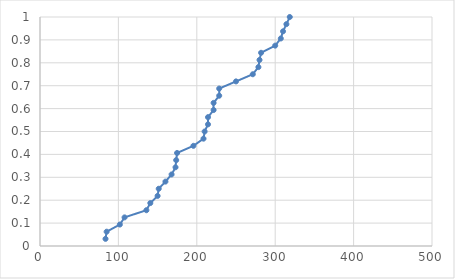
| Category | Series 0 |
|---|---|
| 83.57142857142857 | 0.031 |
| 85.0 | 0.062 |
| 101.85714285714286 | 0.094 |
| 107.85714285714286 | 0.125 |
| 135.71428571428572 | 0.156 |
| 140.71428571428572 | 0.188 |
| 150.0 | 0.219 |
| 151.42857142857142 | 0.25 |
| 160.0 | 0.281 |
| 167.85714285714286 | 0.312 |
| 172.85714285714286 | 0.344 |
| 173.71428571428572 | 0.375 |
| 174.85714285714286 | 0.406 |
| 195.71428571428572 | 0.438 |
| 208.57142857142858 | 0.469 |
| 210.0 | 0.5 |
| 214.28571428571428 | 0.531 |
| 214.28571428571428 | 0.562 |
| 221.42857142857142 | 0.594 |
| 221.42857142857142 | 0.625 |
| 228.57142857142858 | 0.656 |
| 228.57142857142858 | 0.688 |
| 250.0 | 0.719 |
| 271.42857142857144 | 0.75 |
| 278.57142857142856 | 0.781 |
| 280.0 | 0.812 |
| 282.0 | 0.844 |
| 300.0 | 0.875 |
| 307.14285714285717 | 0.906 |
| 310.0 | 0.938 |
| 314.2857142857143 | 0.969 |
| 318.57142857142856 | 1 |